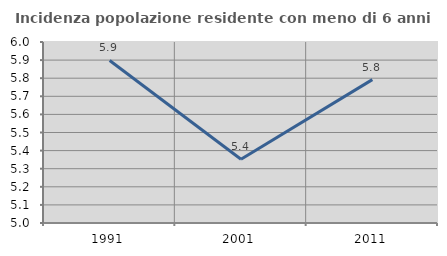
| Category | Incidenza popolazione residente con meno di 6 anni |
|---|---|
| 1991.0 | 5.898 |
| 2001.0 | 5.353 |
| 2011.0 | 5.792 |